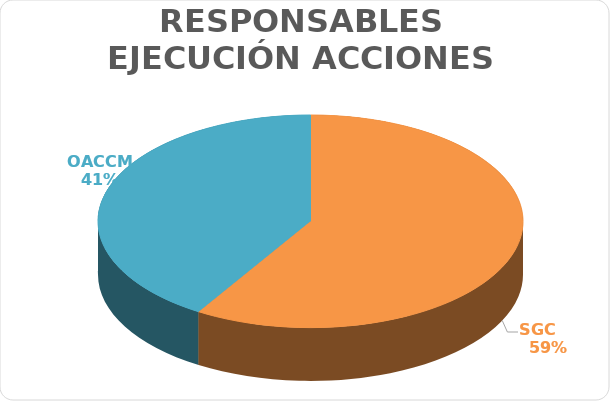
| Category | Series 0 |
|---|---|
| SGC     | 10 |
| OACCM | 7 |